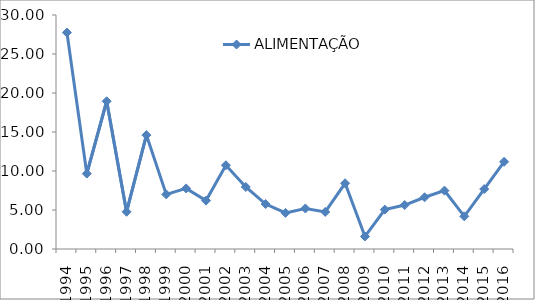
| Category | ALIMENTAÇÃO |
|---|---|
| 1994.0 | 27.749 |
| 1995.0 | 9.667 |
| 1996.0 | 18.941 |
| 1997.0 | 4.77 |
| 1998.0 | 14.599 |
| 1999.0 | 7 |
| 2000.0 | 7.767 |
| 2001.0 | 6.204 |
| 2002.0 | 10.742 |
| 2003.0 | 7.956 |
| 2004.0 | 5.762 |
| 2005.0 | 4.628 |
| 2006.0 | 5.195 |
| 2007.0 | 4.748 |
| 2008.0 | 8.425 |
| 2009.0 | 1.605 |
| 2010.0 | 5.049 |
| 2011.0 | 5.637 |
| 2012.0 | 6.632 |
| 2013.0 | 7.49 |
| 2014.0 | 4.188 |
| 2015.0 | 7.685 |
| 2016.0 | 11.179 |